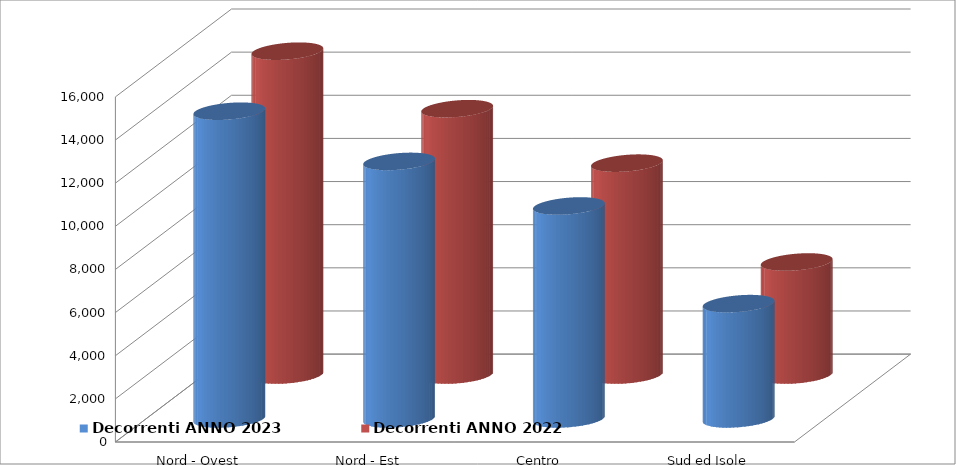
| Category | Decorrenti ANNO 2023 | Decorrenti ANNO 2022 |
|---|---|---|
| Nord - Ovest | 14268 | 15014 |
| Nord - Est | 11941 | 12347 |
| Centro | 9875 | 9823 |
| Sud ed Isole | 5347 | 5241 |